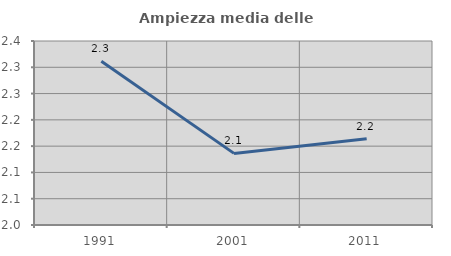
| Category | Ampiezza media delle famiglie |
|---|---|
| 1991.0 | 2.311 |
| 2001.0 | 2.136 |
| 2011.0 | 2.164 |